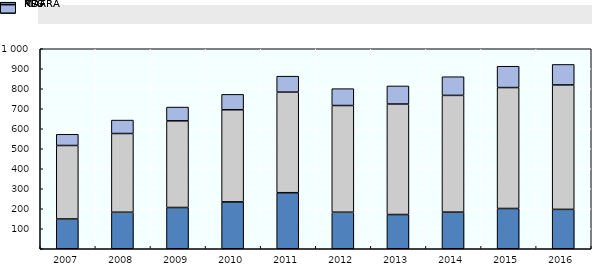
| Category | MAFRA | RDA | KFS |
|---|---|---|---|
| 2007.0 | 148.9 | 367.4 | 56 |
| 2008.0 | 182.7 | 393.5 | 67.2 |
| 2009.0 | 206.3 | 433.3 | 68.9 |
| 2010.0 | 234.4 | 460.6 | 76.9 |
| 2011.0 | 280.3 | 502.8 | 79.8 |
| 2012.0 | 182.8 | 533.3 | 84.4 |
| 2013.0 | 171.1 | 552.5 | 90.4 |
| 2014.0 | 183.2 | 583.6 | 93.4 |
| 2015.0 | 201.4 | 604.6 | 106.6 |
| 2016.0 | 196.9 | 622.2 | 102.5 |